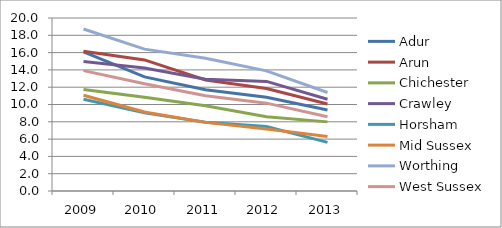
| Category | Adur | Arun | Chichester | Crawley | Horsham | Mid Sussex | Worthing | West Sussex |
|---|---|---|---|---|---|---|---|---|
| 2009.0 | 16.076 | 16.147 | 11.729 | 14.965 | 10.598 | 11.071 | 18.724 | 13.915 |
| 2010.0 | 13.19 | 15.152 | 10.834 | 14.208 | 9.031 | 9.138 | 16.4 | 12.394 |
| 2011.0 | 11.706 | 12.829 | 9.851 | 12.919 | 7.937 | 7.932 | 15.343 | 11.018 |
| 2012.0 | 10.842 | 11.842 | 8.579 | 12.667 | 7.458 | 7.155 | 13.886 | 10.156 |
| 2013.0 | 9.375 | 10.053 | 7.992 | 10.602 | 5.626 | 6.313 | 11.391 | 8.589 |